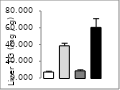
| Category | Series 0 |
|---|---|
| 0 | 7.101 |
| 1 | 38.451 |
| 2 | 8.544 |
| 3 | 60.452 |